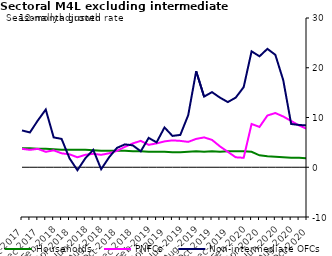
| Category | zero | Households | PNFCs | Non-intermediate OFCs |
|---|---|---|---|---|
| Oct-2017 | 0 | 3.8 | 3.7 | 7.4 |
| Nov-2017 | 0 | 3.8 | 3.5 | 7 |
| Dec-2017 | 0 | 3.7 | 3.7 | 9.4 |
| Jan-2018 | 0 | 3.7 | 3.1 | 11.6 |
| Feb-2018 | 0 | 3.6 | 3.4 | 6 |
| Mar-2018 | 0 | 3.5 | 2.8 | 5.7 |
| Apr-2018 | 0 | 3.5 | 2.6 | 1.8 |
| May-2018 | 0 | 3.5 | 2 | -0.6 |
| Jun-2018 | 0 | 3.5 | 2.5 | 1.8 |
| Jul-2018 | 0 | 3.4 | 2.7 | 3.5 |
| Aug-2018 | 0 | 3.3 | 2.5 | -0.4 |
| Sep-2018 | 0 | 3.3 | 2.8 | 2 |
| Oct-2018 | 0 | 3.3 | 3.3 | 3.9 |
| Nov-2018 | 0 | 3.3 | 4.1 | 4.6 |
| Dec-2018 | 0 | 3.2 | 4.8 | 4.4 |
| Jan-2019 | 0 | 3.2 | 5.3 | 3.2 |
| Feb-2019 | 0 | 3.1 | 4.5 | 5.9 |
| Mar-2019 | 0 | 3.1 | 4.8 | 5 |
| Apr-2019 | 0 | 3.1 | 5.2 | 8 |
| May-2019 | 0 | 3 | 5.4 | 6.3 |
| Jun-2019 | 0 | 3 | 5.3 | 6.5 |
| Jul-2019 | 0 | 3.1 | 5.1 | 10.5 |
| Aug-2019 | 0 | 3.2 | 5.7 | 19.3 |
| Sep-2019 | 0 | 3.1 | 6 | 14.2 |
| Oct-2019 | 0 | 3.2 | 5.5 | 15.1 |
| Nov-2019 | 0 | 3.1 | 4.2 | 14 |
| Dec-2019 | 0 | 3.2 | 3.1 | 13.1 |
| Jan-2020 | 0 | 3.2 | 2 | 14 |
| Feb-2020 | 0 | 3.2 | 1.9 | 16.1 |
| Mar-2020 | 0 | 3.1 | 8.7 | 23.3 |
| Apr-2020 | 0 | 2.4 | 8.1 | 22.3 |
| May-2020 | 0 | 2.2 | 10.4 | 23.8 |
| Jun-2020 | 0 | 2.1 | 10.9 | 22.6 |
| Jul-2020 | 0 | 2 | 10.2 | 17.5 |
| Aug-2020 | 0 | 1.9 | 9.3 | 8.7 |
| Sep-2020 | 0 | 1.9 | 8.4 | 8.5 |
| Oct-2020 | 0 | 1.8 | 7.7 | 8.4 |